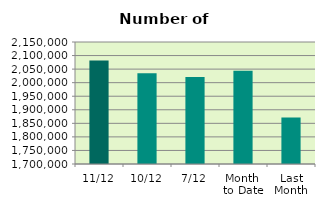
| Category | Series 0 |
|---|---|
| 11/12 | 2082126 |
| 10/12 | 2034428 |
| 7/12 | 2020544 |
| Month 
to Date | 2043714.571 |
| Last
Month | 1871523.909 |